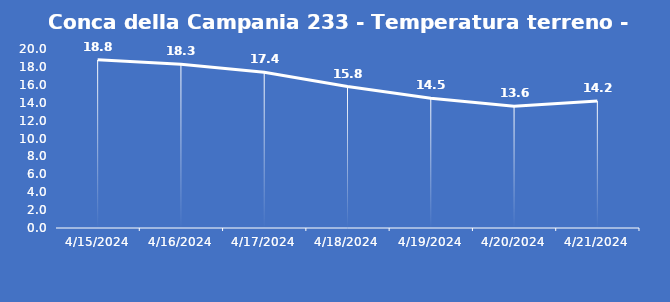
| Category | Conca della Campania 233 - Temperatura terreno - Grezzo (°C) |
|---|---|
| 4/15/24 | 18.8 |
| 4/16/24 | 18.3 |
| 4/17/24 | 17.4 |
| 4/18/24 | 15.8 |
| 4/19/24 | 14.5 |
| 4/20/24 | 13.6 |
| 4/21/24 | 14.2 |